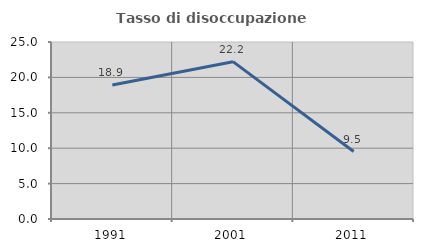
| Category | Tasso di disoccupazione giovanile  |
|---|---|
| 1991.0 | 18.919 |
| 2001.0 | 22.222 |
| 2011.0 | 9.524 |